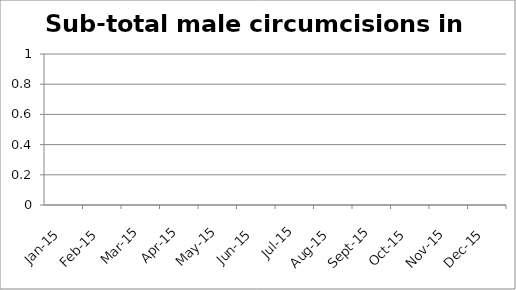
| Category | Conducted in theatre | Outreach |
|---|---|---|
| 2015-01-01 | 0 | 0 |
| 2015-02-01 | 0 | 0 |
| 2015-03-01 | 0 | 0 |
| 2015-04-01 | 0 | 0 |
| 2015-05-01 | 0 | 0 |
| 2015-06-01 | 0 | 0 |
| 2015-07-01 | 0 | 0 |
| 2015-08-01 | 0 | 0 |
| 2015-09-01 | 0 | 0 |
| 2015-10-01 | 0 | 0 |
| 2015-11-01 | 0 | 0 |
| 2015-12-01 | 0 | 0 |